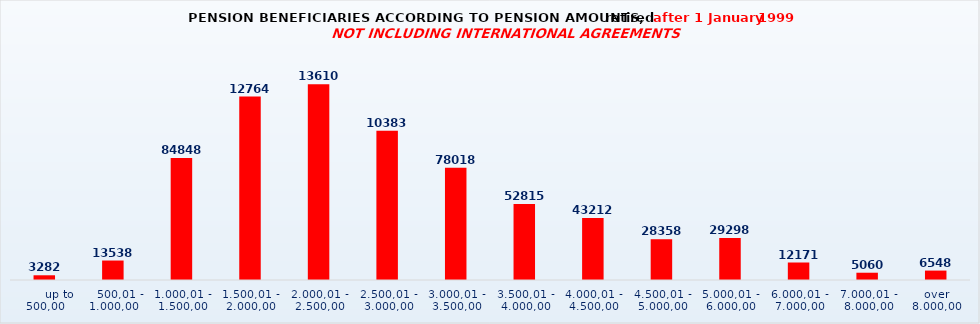
| Category | Series 0 |
|---|---|
|       up to 500,00 | 3282 |
|    500,01 - 1.000,00 | 13538 |
| 1.000,01 - 1.500,00 | 84848 |
| 1.500,01 - 2.000,00 | 127644 |
| 2.000,01 - 2.500,00 | 136109 |
| 2.500,01 - 3.000,00 | 103839 |
| 3.000,01 - 3.500,00 | 78018 |
| 3.500,01 - 4.000,00 | 52815 |
| 4.000,01 - 4.500,00 | 43212 |
| 4.500,01 - 5.000,00 | 28358 |
| 5.000,01 - 6.000,00 | 29298 |
| 6.000,01 - 7.000,00 | 12171 |
| 7.000,01 - 8.000,00 | 5060 |
| over 8.000,00 | 6548 |